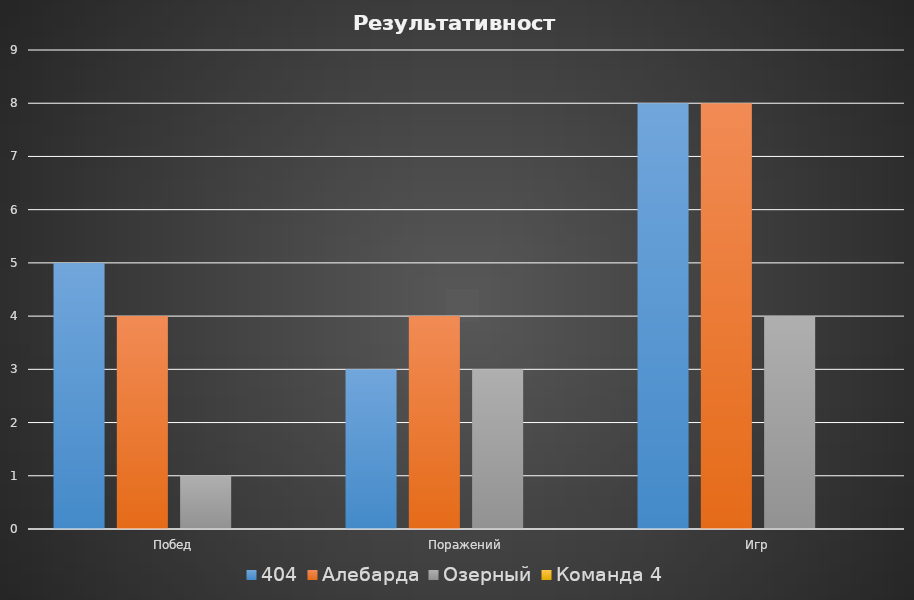
| Category | 404 | Алебарда | Озерный | Команда 4 |
|---|---|---|---|---|
| Побед | 5 | 4 | 1 | 0 |
| Поражений | 3 | 4 | 3 | 0 |
| Игр | 8 | 8 | 4 | 0 |